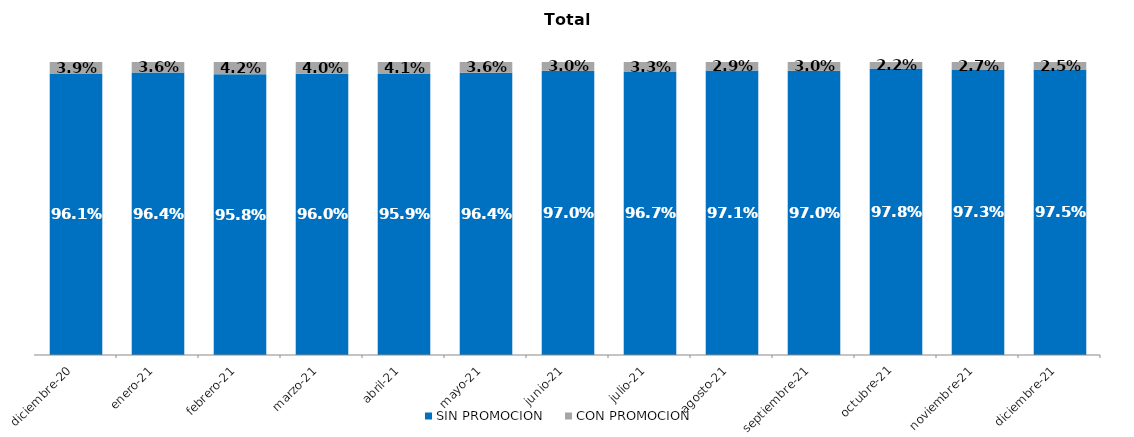
| Category | SIN PROMOCION   | CON PROMOCION   |
|---|---|---|
| 2020-12-01 | 0.961 | 0.039 |
| 2021-01-01 | 0.964 | 0.036 |
| 2021-02-01 | 0.958 | 0.042 |
| 2021-03-01 | 0.96 | 0.04 |
| 2021-04-01 | 0.959 | 0.041 |
| 2021-05-01 | 0.964 | 0.036 |
| 2021-06-01 | 0.97 | 0.03 |
| 2021-07-01 | 0.967 | 0.033 |
| 2021-08-01 | 0.971 | 0.029 |
| 2021-09-01 | 0.97 | 0.03 |
| 2021-10-01 | 0.978 | 0.022 |
| 2021-11-01 | 0.973 | 0.027 |
| 2021-12-01 | 0.975 | 0.025 |